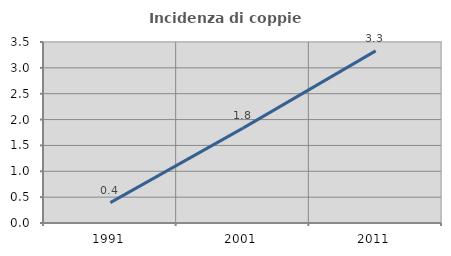
| Category | Incidenza di coppie miste |
|---|---|
| 1991.0 | 0.395 |
| 2001.0 | 1.835 |
| 2011.0 | 3.328 |